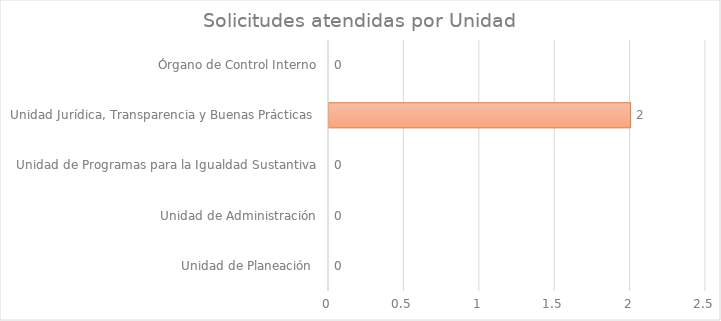
| Category | Series 1 |
|---|---|
| Unidad de Planeación  | 0 |
| Unidad de Administración | 0 |
| Unidad de Programas para la Igualdad Sustantiva | 0 |
| Unidad Jurídica, Transparencia y Buenas Prácticas  | 2 |
| Órgano de Control Interno | 0 |